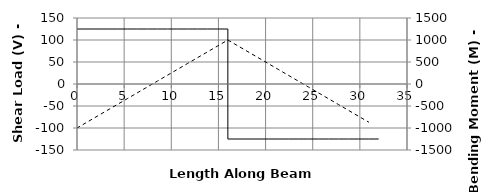
| Category | V |
|---|---|
| 0.0 | 125 |
| 0.0 | 125 |
| 0.0 | 125 |
| 1.0666666666666667 | 125 |
| 2.1333333333333333 | 125 |
| 3.2 | 125 |
| 4.266666666666667 | 125 |
| 5.333333333333333 | 125 |
| 6.4 | 125 |
| 7.466666666666667 | 125 |
| 8.533333333333333 | 125 |
| 9.6 | 125 |
| 10.666666666666666 | 125 |
| 11.733333333333333 | 125 |
| 12.8 | 125 |
| 13.866666666666667 | 125 |
| 14.933333333333334 | 125 |
| 15.999 | 125 |
| 16.0 | -125 |
| 16.001 | -125 |
| 17.066666666666666 | -125 |
| 18.133333333333333 | -125 |
| 19.2 | -125 |
| 20.266666666666666 | -125 |
| 21.333333333333332 | -125 |
| 22.4 | -125 |
| 23.466666666666665 | -125 |
| 24.53333333333333 | -125 |
| 25.6 | -125 |
| 26.666666666666668 | -125 |
| 27.733333333333334 | -125 |
| 28.8 | -125 |
| 29.866666666666667 | -125 |
| 30.933333333333334 | -125 |
| 32.0 | -125 |